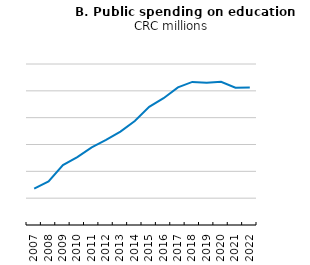
| Category | Public spending in education, million of colon |
|---|---|
| 2007.0 | 678608.82 |
| 2008.0 | 811805.99 |
| 2009.0 | 1116042 |
| 2010.0 | 1266077 |
| 2011.0 | 1446533 |
| 2012.0 | 1584779 |
| 2013.0 | 1739517 |
| 2014.0 | 1937628 |
| 2015.0 | 2201008.53 |
| 2016.0 | 2362194 |
| 2017.0 | 2564941 |
| 2018.0 | 2666047.76 |
| 2019.0 | 2648412 |
| 2020.0 | 2670018 |
| 2021.0 | 2558490.7 |
| 2022.0 | 2564247 |